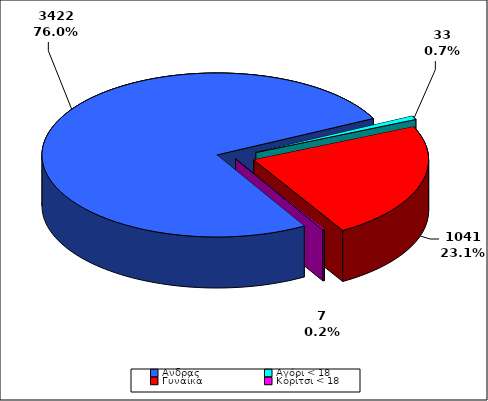
| Category | TOTAL |
|---|---|
| Aνδρας | 3422 |
| Αγόρι < 18 | 33 |
| Γυναίκα | 1041 |
| Κορίτσι < 18 | 7 |